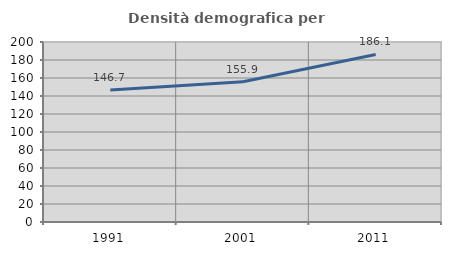
| Category | Densità demografica |
|---|---|
| 1991.0 | 146.73 |
| 2001.0 | 155.873 |
| 2011.0 | 186.113 |